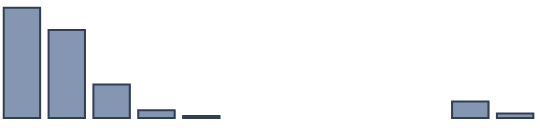
| Category | Series 0 |
|---|---|
| 0 | 42 |
| 1 | 33.6 |
| 2 | 12.8 |
| 3 | 3 |
| 4 | 0.8 |
| 5 | 0 |
| 6 | 0 |
| 7 | 0 |
| 8 | 0 |
| 9 | 0 |
| 10 | 6.3 |
| 11 | 1.7 |